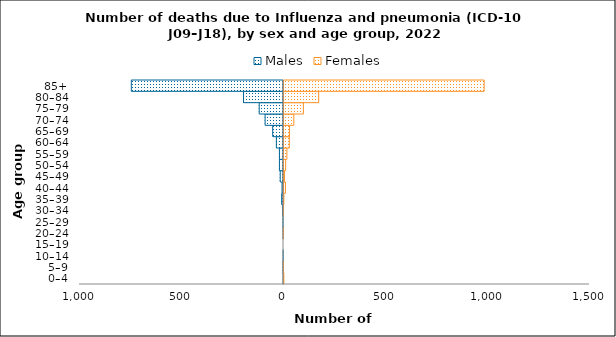
| Category | Males | Females |
|---|---|---|
| 0–4 | -1 | 4 |
| 5–9 | -2 | 2 |
| 10–14 | -1 | 0 |
| 15–19 | 0 | 0 |
| 20–24 | -1 | 1 |
| 25–29 | -2 | 0 |
| 30–34 | -3 | 2 |
| 35–39 | -9 | 4 |
| 40–44 | -7 | 12 |
| 45–49 | -16 | 7 |
| 50–54 | -20 | 13 |
| 55–59 | -20 | 19 |
| 60–64 | -35 | 31 |
| 65–69 | -53 | 32 |
| 70–74 | -90 | 53 |
| 75–79 | -119 | 100 |
| 80–84 | -196 | 175 |
| 85+ | -746 | 986 |